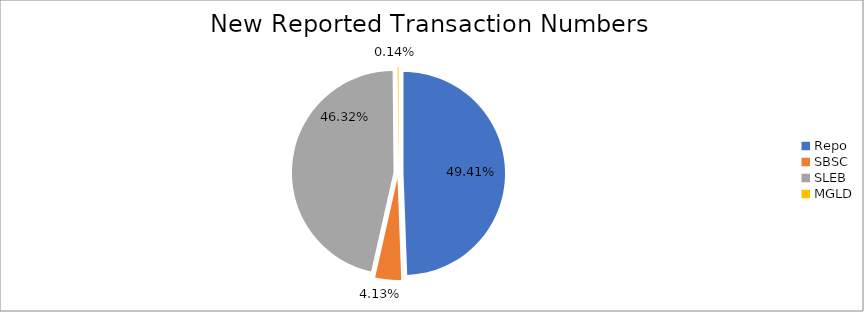
| Category | Series 0 |
|---|---|
| Repo | 375883 |
| SBSC | 31380 |
| SLEB | 352399 |
| MGLD | 1062 |